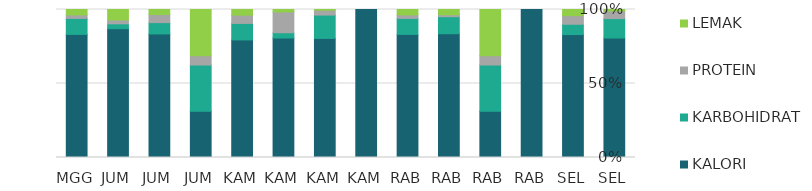
| Category | KALORI | KARBOHIDRAT | PROTEIN | LEMAK |
|---|---|---|---|---|
| SEL | 283 | 46 | 18 | 3.5 |
| SEL | 500 | 42 | 35 | 25 |
| RAB | 1 | 0 | 0 | 0 |
| RAB | 10 | 10 | 2 | 10 |
| RAB | 189 | 26 | 3 | 8 |
| RAB | 477 | 62 | 13.5 | 21 |
| KAM | 1 | 0 | 0 | 0 |
| KAM | 245 | 48 | 10 | 1.5 |
| KAM | 247 | 11 | 43 | 5 |
| KAM | 456 | 64 | 32 | 22 |
| JUM | 10 | 10 | 2 | 10 |
| JUM | 135 | 12.36 | 8.81 | 5.51 |
| JUM | 184 | 7 | 5.43 | 15 |
| MGG | 477 | 62 | 13.5 | 21 |